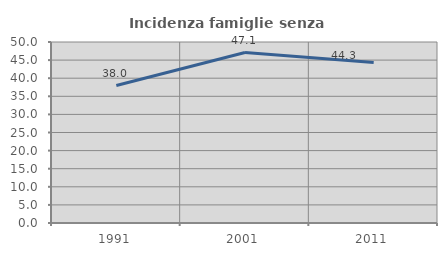
| Category | Incidenza famiglie senza nuclei |
|---|---|
| 1991.0 | 37.975 |
| 2001.0 | 47.093 |
| 2011.0 | 44.304 |